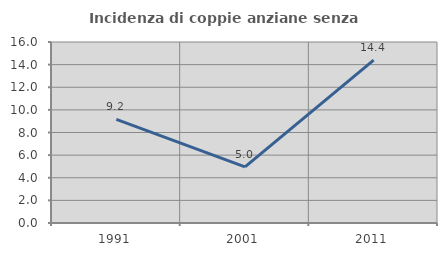
| Category | Incidenza di coppie anziane senza figli  |
|---|---|
| 1991.0 | 9.167 |
| 2001.0 | 4.959 |
| 2011.0 | 14.4 |